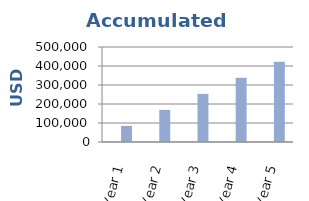
| Category | Series 0 | Series 1 |
|---|---|---|
| Year 1 |  | 84458.608 |
| Year 2 |  | 168917.216 |
| Year 3 |  | 253375.824 |
| Year 4 |  | 337834.431 |
| Year 5 |  | 422293.039 |